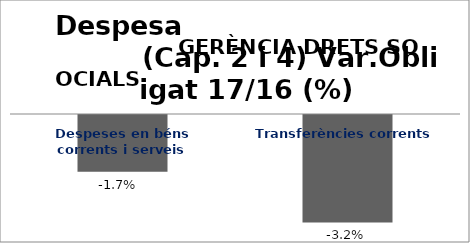
| Category | Series 0 |
|---|---|
| Despeses en béns corrents i serveis | -0.017 |
| Transferències corrents | -0.032 |